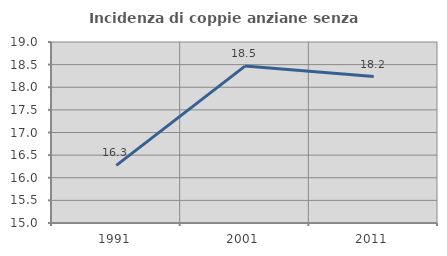
| Category | Incidenza di coppie anziane senza figli  |
|---|---|
| 1991.0 | 16.274 |
| 2001.0 | 18.468 |
| 2011.0 | 18.235 |